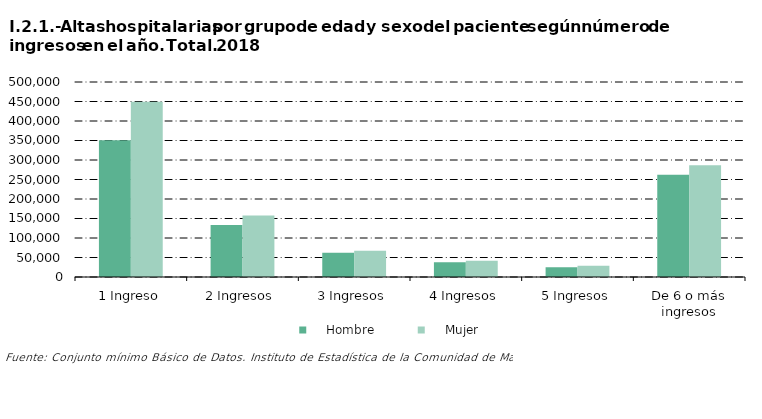
| Category |     Hombre |     Mujer |
|---|---|---|
| 1 Ingreso | 350787 | 449240 |
| 2 Ingresos | 133280 | 157866 |
| 3 Ingresos | 62453 | 67588 |
| 4 Ingresos | 37554 | 41406 |
| 5 Ingresos | 24959 | 28776 |
| De 6 o más ingresos | 262155 | 286707 |